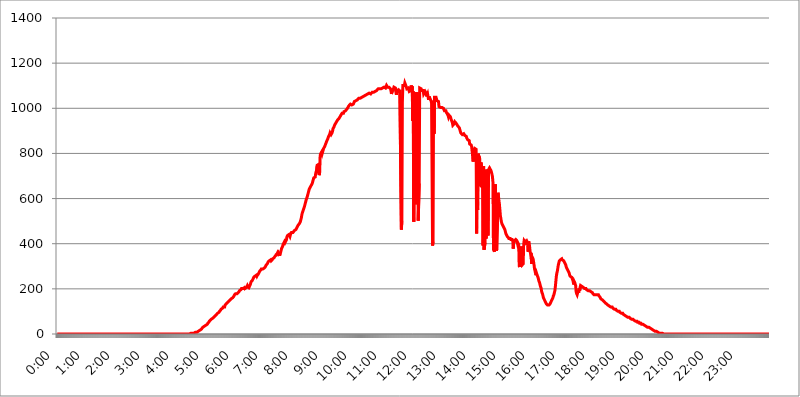
| Category | 2015.06.02. Intenzitás [W/m^2] |
|---|---|
| 0.0 | 0 |
| 0.0006944444444444445 | 0 |
| 0.001388888888888889 | 0 |
| 0.0020833333333333333 | 0 |
| 0.002777777777777778 | 0 |
| 0.003472222222222222 | 0 |
| 0.004166666666666667 | 0 |
| 0.004861111111111111 | 0 |
| 0.005555555555555556 | 0 |
| 0.0062499999999999995 | 0 |
| 0.006944444444444444 | 0 |
| 0.007638888888888889 | 0 |
| 0.008333333333333333 | 0 |
| 0.009027777777777779 | 0 |
| 0.009722222222222222 | 0 |
| 0.010416666666666666 | 0 |
| 0.011111111111111112 | 0 |
| 0.011805555555555555 | 0 |
| 0.012499999999999999 | 0 |
| 0.013194444444444444 | 0 |
| 0.013888888888888888 | 0 |
| 0.014583333333333332 | 0 |
| 0.015277777777777777 | 0 |
| 0.015972222222222224 | 0 |
| 0.016666666666666666 | 0 |
| 0.017361111111111112 | 0 |
| 0.018055555555555557 | 0 |
| 0.01875 | 0 |
| 0.019444444444444445 | 0 |
| 0.02013888888888889 | 0 |
| 0.020833333333333332 | 0 |
| 0.02152777777777778 | 0 |
| 0.022222222222222223 | 0 |
| 0.02291666666666667 | 0 |
| 0.02361111111111111 | 0 |
| 0.024305555555555556 | 0 |
| 0.024999999999999998 | 0 |
| 0.025694444444444447 | 0 |
| 0.02638888888888889 | 0 |
| 0.027083333333333334 | 0 |
| 0.027777777777777776 | 0 |
| 0.02847222222222222 | 0 |
| 0.029166666666666664 | 0 |
| 0.029861111111111113 | 0 |
| 0.030555555555555555 | 0 |
| 0.03125 | 0 |
| 0.03194444444444445 | 0 |
| 0.03263888888888889 | 0 |
| 0.03333333333333333 | 0 |
| 0.034027777777777775 | 0 |
| 0.034722222222222224 | 0 |
| 0.035416666666666666 | 0 |
| 0.036111111111111115 | 0 |
| 0.03680555555555556 | 0 |
| 0.0375 | 0 |
| 0.03819444444444444 | 0 |
| 0.03888888888888889 | 0 |
| 0.03958333333333333 | 0 |
| 0.04027777777777778 | 0 |
| 0.04097222222222222 | 0 |
| 0.041666666666666664 | 0 |
| 0.042361111111111106 | 0 |
| 0.04305555555555556 | 0 |
| 0.043750000000000004 | 0 |
| 0.044444444444444446 | 0 |
| 0.04513888888888889 | 0 |
| 0.04583333333333334 | 0 |
| 0.04652777777777778 | 0 |
| 0.04722222222222222 | 0 |
| 0.04791666666666666 | 0 |
| 0.04861111111111111 | 0 |
| 0.049305555555555554 | 0 |
| 0.049999999999999996 | 0 |
| 0.05069444444444445 | 0 |
| 0.051388888888888894 | 0 |
| 0.052083333333333336 | 0 |
| 0.05277777777777778 | 0 |
| 0.05347222222222222 | 0 |
| 0.05416666666666667 | 0 |
| 0.05486111111111111 | 0 |
| 0.05555555555555555 | 0 |
| 0.05625 | 0 |
| 0.05694444444444444 | 0 |
| 0.057638888888888885 | 0 |
| 0.05833333333333333 | 0 |
| 0.05902777777777778 | 0 |
| 0.059722222222222225 | 0 |
| 0.06041666666666667 | 0 |
| 0.061111111111111116 | 0 |
| 0.06180555555555556 | 0 |
| 0.0625 | 0 |
| 0.06319444444444444 | 0 |
| 0.06388888888888888 | 0 |
| 0.06458333333333334 | 0 |
| 0.06527777777777778 | 0 |
| 0.06597222222222222 | 0 |
| 0.06666666666666667 | 0 |
| 0.06736111111111111 | 0 |
| 0.06805555555555555 | 0 |
| 0.06874999999999999 | 0 |
| 0.06944444444444443 | 0 |
| 0.07013888888888889 | 0 |
| 0.07083333333333333 | 0 |
| 0.07152777777777779 | 0 |
| 0.07222222222222223 | 0 |
| 0.07291666666666667 | 0 |
| 0.07361111111111111 | 0 |
| 0.07430555555555556 | 0 |
| 0.075 | 0 |
| 0.07569444444444444 | 0 |
| 0.0763888888888889 | 0 |
| 0.07708333333333334 | 0 |
| 0.07777777777777778 | 0 |
| 0.07847222222222222 | 0 |
| 0.07916666666666666 | 0 |
| 0.0798611111111111 | 0 |
| 0.08055555555555556 | 0 |
| 0.08125 | 0 |
| 0.08194444444444444 | 0 |
| 0.08263888888888889 | 0 |
| 0.08333333333333333 | 0 |
| 0.08402777777777777 | 0 |
| 0.08472222222222221 | 0 |
| 0.08541666666666665 | 0 |
| 0.08611111111111112 | 0 |
| 0.08680555555555557 | 0 |
| 0.08750000000000001 | 0 |
| 0.08819444444444445 | 0 |
| 0.08888888888888889 | 0 |
| 0.08958333333333333 | 0 |
| 0.09027777777777778 | 0 |
| 0.09097222222222222 | 0 |
| 0.09166666666666667 | 0 |
| 0.09236111111111112 | 0 |
| 0.09305555555555556 | 0 |
| 0.09375 | 0 |
| 0.09444444444444444 | 0 |
| 0.09513888888888888 | 0 |
| 0.09583333333333333 | 0 |
| 0.09652777777777777 | 0 |
| 0.09722222222222222 | 0 |
| 0.09791666666666667 | 0 |
| 0.09861111111111111 | 0 |
| 0.09930555555555555 | 0 |
| 0.09999999999999999 | 0 |
| 0.10069444444444443 | 0 |
| 0.1013888888888889 | 0 |
| 0.10208333333333335 | 0 |
| 0.10277777777777779 | 0 |
| 0.10347222222222223 | 0 |
| 0.10416666666666667 | 0 |
| 0.10486111111111111 | 0 |
| 0.10555555555555556 | 0 |
| 0.10625 | 0 |
| 0.10694444444444444 | 0 |
| 0.1076388888888889 | 0 |
| 0.10833333333333334 | 0 |
| 0.10902777777777778 | 0 |
| 0.10972222222222222 | 0 |
| 0.1111111111111111 | 0 |
| 0.11180555555555556 | 0 |
| 0.11180555555555556 | 0 |
| 0.1125 | 0 |
| 0.11319444444444444 | 0 |
| 0.11388888888888889 | 0 |
| 0.11458333333333333 | 0 |
| 0.11527777777777777 | 0 |
| 0.11597222222222221 | 0 |
| 0.11666666666666665 | 0 |
| 0.1173611111111111 | 0 |
| 0.11805555555555557 | 0 |
| 0.11944444444444445 | 0 |
| 0.12013888888888889 | 0 |
| 0.12083333333333333 | 0 |
| 0.12152777777777778 | 0 |
| 0.12222222222222223 | 0 |
| 0.12291666666666667 | 0 |
| 0.12291666666666667 | 0 |
| 0.12361111111111112 | 0 |
| 0.12430555555555556 | 0 |
| 0.125 | 0 |
| 0.12569444444444444 | 0 |
| 0.12638888888888888 | 0 |
| 0.12708333333333333 | 0 |
| 0.16875 | 0 |
| 0.12847222222222224 | 0 |
| 0.12916666666666668 | 0 |
| 0.12986111111111112 | 0 |
| 0.13055555555555556 | 0 |
| 0.13125 | 0 |
| 0.13194444444444445 | 0 |
| 0.1326388888888889 | 0 |
| 0.13333333333333333 | 0 |
| 0.13402777777777777 | 0 |
| 0.13402777777777777 | 0 |
| 0.13472222222222222 | 0 |
| 0.13541666666666666 | 0 |
| 0.1361111111111111 | 0 |
| 0.13749999999999998 | 0 |
| 0.13819444444444443 | 0 |
| 0.1388888888888889 | 0 |
| 0.13958333333333334 | 0 |
| 0.14027777777777778 | 0 |
| 0.14097222222222222 | 0 |
| 0.14166666666666666 | 0 |
| 0.1423611111111111 | 0 |
| 0.14305555555555557 | 0 |
| 0.14375000000000002 | 0 |
| 0.14444444444444446 | 0 |
| 0.1451388888888889 | 0 |
| 0.1451388888888889 | 0 |
| 0.14652777777777778 | 0 |
| 0.14722222222222223 | 0 |
| 0.14791666666666667 | 0 |
| 0.1486111111111111 | 0 |
| 0.14930555555555555 | 0 |
| 0.15 | 0 |
| 0.15069444444444444 | 0 |
| 0.15138888888888888 | 0 |
| 0.15208333333333332 | 0 |
| 0.15277777777777776 | 0 |
| 0.15347222222222223 | 0 |
| 0.15416666666666667 | 0 |
| 0.15486111111111112 | 0 |
| 0.15555555555555556 | 0 |
| 0.15625 | 0 |
| 0.15694444444444444 | 0 |
| 0.15763888888888888 | 0 |
| 0.15833333333333333 | 0 |
| 0.15902777777777777 | 0 |
| 0.15972222222222224 | 0 |
| 0.16041666666666668 | 0 |
| 0.16111111111111112 | 0 |
| 0.16180555555555556 | 0 |
| 0.1625 | 0 |
| 0.16319444444444445 | 0 |
| 0.1638888888888889 | 0 |
| 0.16458333333333333 | 0 |
| 0.16527777777777777 | 0 |
| 0.16597222222222222 | 0 |
| 0.16666666666666666 | 0 |
| 0.1673611111111111 | 0 |
| 0.16805555555555554 | 0 |
| 0.16874999999999998 | 0 |
| 0.16944444444444443 | 0 |
| 0.17013888888888887 | 0 |
| 0.1708333333333333 | 0 |
| 0.17152777777777775 | 0 |
| 0.17222222222222225 | 0 |
| 0.1729166666666667 | 0 |
| 0.17361111111111113 | 0 |
| 0.17430555555555557 | 0 |
| 0.17500000000000002 | 0 |
| 0.17569444444444446 | 0 |
| 0.1763888888888889 | 0 |
| 0.17708333333333334 | 0 |
| 0.17777777777777778 | 0 |
| 0.17847222222222223 | 0 |
| 0.17916666666666667 | 0 |
| 0.1798611111111111 | 0 |
| 0.18055555555555555 | 0 |
| 0.18125 | 0 |
| 0.18194444444444444 | 0 |
| 0.1826388888888889 | 0 |
| 0.18333333333333335 | 0 |
| 0.1840277777777778 | 0 |
| 0.18472222222222223 | 0 |
| 0.18541666666666667 | 0 |
| 0.18611111111111112 | 0 |
| 0.18680555555555556 | 3.525 |
| 0.1875 | 3.525 |
| 0.18819444444444444 | 3.525 |
| 0.18888888888888888 | 3.525 |
| 0.18958333333333333 | 3.525 |
| 0.19027777777777777 | 3.525 |
| 0.1909722222222222 | 3.525 |
| 0.19166666666666665 | 3.525 |
| 0.19236111111111112 | 3.525 |
| 0.19305555555555554 | 3.525 |
| 0.19375 | 7.887 |
| 0.19444444444444445 | 7.887 |
| 0.1951388888888889 | 7.887 |
| 0.19583333333333333 | 7.887 |
| 0.19652777777777777 | 12.257 |
| 0.19722222222222222 | 12.257 |
| 0.19791666666666666 | 12.257 |
| 0.1986111111111111 | 12.257 |
| 0.19930555555555554 | 12.257 |
| 0.19999999999999998 | 16.636 |
| 0.20069444444444443 | 16.636 |
| 0.20138888888888887 | 16.636 |
| 0.2020833333333333 | 21.024 |
| 0.2027777777777778 | 21.024 |
| 0.2034722222222222 | 25.419 |
| 0.2041666666666667 | 29.823 |
| 0.20486111111111113 | 29.823 |
| 0.20555555555555557 | 29.823 |
| 0.20625000000000002 | 34.234 |
| 0.20694444444444446 | 34.234 |
| 0.2076388888888889 | 38.653 |
| 0.20833333333333334 | 38.653 |
| 0.20902777777777778 | 43.079 |
| 0.20972222222222223 | 43.079 |
| 0.21041666666666667 | 43.079 |
| 0.2111111111111111 | 47.511 |
| 0.21180555555555555 | 47.511 |
| 0.2125 | 51.951 |
| 0.21319444444444444 | 56.398 |
| 0.2138888888888889 | 56.398 |
| 0.21458333333333335 | 60.85 |
| 0.2152777777777778 | 60.85 |
| 0.21597222222222223 | 65.31 |
| 0.21666666666666667 | 65.31 |
| 0.21736111111111112 | 65.31 |
| 0.21805555555555556 | 69.775 |
| 0.21875 | 69.775 |
| 0.21944444444444444 | 74.246 |
| 0.22013888888888888 | 74.246 |
| 0.22083333333333333 | 78.722 |
| 0.22152777777777777 | 78.722 |
| 0.2222222222222222 | 83.205 |
| 0.22291666666666665 | 83.205 |
| 0.2236111111111111 | 87.692 |
| 0.22430555555555556 | 87.692 |
| 0.225 | 92.184 |
| 0.22569444444444445 | 92.184 |
| 0.2263888888888889 | 92.184 |
| 0.22708333333333333 | 96.682 |
| 0.22777777777777777 | 101.184 |
| 0.22847222222222222 | 101.184 |
| 0.22916666666666666 | 105.69 |
| 0.2298611111111111 | 110.201 |
| 0.23055555555555554 | 110.201 |
| 0.23124999999999998 | 110.201 |
| 0.23194444444444443 | 114.716 |
| 0.23263888888888887 | 119.235 |
| 0.2333333333333333 | 119.235 |
| 0.2340277777777778 | 119.235 |
| 0.2347222222222222 | 119.235 |
| 0.2354166666666667 | 128.284 |
| 0.23611111111111113 | 128.284 |
| 0.23680555555555557 | 132.814 |
| 0.23750000000000002 | 132.814 |
| 0.23819444444444446 | 137.347 |
| 0.2388888888888889 | 137.347 |
| 0.23958333333333334 | 141.884 |
| 0.24027777777777778 | 141.884 |
| 0.24097222222222223 | 146.423 |
| 0.24166666666666667 | 146.423 |
| 0.2423611111111111 | 150.964 |
| 0.24305555555555555 | 150.964 |
| 0.24375 | 155.509 |
| 0.24444444444444446 | 155.509 |
| 0.24513888888888888 | 155.509 |
| 0.24583333333333335 | 160.056 |
| 0.2465277777777778 | 160.056 |
| 0.24722222222222223 | 164.605 |
| 0.24791666666666667 | 169.156 |
| 0.24861111111111112 | 173.709 |
| 0.24930555555555556 | 173.709 |
| 0.25 | 178.264 |
| 0.25069444444444444 | 178.264 |
| 0.2513888888888889 | 178.264 |
| 0.2520833333333333 | 178.264 |
| 0.25277777777777777 | 178.264 |
| 0.2534722222222222 | 182.82 |
| 0.25416666666666665 | 182.82 |
| 0.2548611111111111 | 187.378 |
| 0.2555555555555556 | 191.937 |
| 0.25625000000000003 | 191.937 |
| 0.2569444444444445 | 191.937 |
| 0.2576388888888889 | 196.497 |
| 0.25833333333333336 | 201.058 |
| 0.2590277777777778 | 201.058 |
| 0.25972222222222224 | 201.058 |
| 0.2604166666666667 | 201.058 |
| 0.2611111111111111 | 201.058 |
| 0.26180555555555557 | 201.058 |
| 0.2625 | 205.62 |
| 0.26319444444444445 | 201.058 |
| 0.2638888888888889 | 201.058 |
| 0.26458333333333334 | 201.058 |
| 0.2652777777777778 | 205.62 |
| 0.2659722222222222 | 210.182 |
| 0.26666666666666666 | 214.746 |
| 0.2673611111111111 | 210.182 |
| 0.26805555555555555 | 210.182 |
| 0.26875 | 205.62 |
| 0.26944444444444443 | 205.62 |
| 0.2701388888888889 | 214.746 |
| 0.2708333333333333 | 219.309 |
| 0.27152777777777776 | 228.436 |
| 0.2722222222222222 | 233 |
| 0.27291666666666664 | 233 |
| 0.2736111111111111 | 237.564 |
| 0.2743055555555555 | 242.127 |
| 0.27499999999999997 | 246.689 |
| 0.27569444444444446 | 251.251 |
| 0.27638888888888885 | 251.251 |
| 0.27708333333333335 | 255.813 |
| 0.2777777777777778 | 255.813 |
| 0.27847222222222223 | 255.813 |
| 0.2791666666666667 | 260.373 |
| 0.2798611111111111 | 255.813 |
| 0.28055555555555556 | 260.373 |
| 0.28125 | 260.373 |
| 0.28194444444444444 | 264.932 |
| 0.2826388888888889 | 269.49 |
| 0.2833333333333333 | 274.047 |
| 0.28402777777777777 | 278.603 |
| 0.2847222222222222 | 278.603 |
| 0.28541666666666665 | 283.156 |
| 0.28611111111111115 | 287.709 |
| 0.28680555555555554 | 287.709 |
| 0.28750000000000003 | 287.709 |
| 0.2881944444444445 | 287.709 |
| 0.2888888888888889 | 287.709 |
| 0.28958333333333336 | 287.709 |
| 0.2902777777777778 | 292.259 |
| 0.29097222222222224 | 292.259 |
| 0.2916666666666667 | 296.808 |
| 0.2923611111111111 | 301.354 |
| 0.29305555555555557 | 305.898 |
| 0.29375 | 305.898 |
| 0.29444444444444445 | 310.44 |
| 0.2951388888888889 | 314.98 |
| 0.29583333333333334 | 319.517 |
| 0.2965277777777778 | 319.517 |
| 0.2972222222222222 | 324.052 |
| 0.29791666666666666 | 324.052 |
| 0.2986111111111111 | 324.052 |
| 0.29930555555555555 | 328.584 |
| 0.3 | 324.052 |
| 0.30069444444444443 | 324.052 |
| 0.3013888888888889 | 328.584 |
| 0.3020833333333333 | 333.113 |
| 0.30277777777777776 | 333.113 |
| 0.3034722222222222 | 333.113 |
| 0.30416666666666664 | 337.639 |
| 0.3048611111111111 | 342.162 |
| 0.3055555555555555 | 342.162 |
| 0.30624999999999997 | 346.682 |
| 0.3069444444444444 | 351.198 |
| 0.3076388888888889 | 351.198 |
| 0.30833333333333335 | 355.712 |
| 0.3090277777777778 | 360.221 |
| 0.30972222222222223 | 355.712 |
| 0.3104166666666667 | 360.221 |
| 0.3111111111111111 | 355.712 |
| 0.31180555555555556 | 346.682 |
| 0.3125 | 355.712 |
| 0.31319444444444444 | 360.221 |
| 0.3138888888888889 | 369.23 |
| 0.3145833333333333 | 378.224 |
| 0.31527777777777777 | 382.715 |
| 0.3159722222222222 | 387.202 |
| 0.31666666666666665 | 396.164 |
| 0.31736111111111115 | 400.638 |
| 0.31805555555555554 | 405.108 |
| 0.31875000000000003 | 409.574 |
| 0.3194444444444445 | 405.108 |
| 0.3201388888888889 | 409.574 |
| 0.32083333333333336 | 414.035 |
| 0.3215277777777778 | 418.492 |
| 0.32222222222222224 | 431.833 |
| 0.3229166666666667 | 436.27 |
| 0.3236111111111111 | 436.27 |
| 0.32430555555555557 | 436.27 |
| 0.325 | 440.702 |
| 0.32569444444444445 | 436.27 |
| 0.3263888888888889 | 431.833 |
| 0.32708333333333334 | 440.702 |
| 0.3277777777777778 | 445.129 |
| 0.3284722222222222 | 449.551 |
| 0.32916666666666666 | 449.551 |
| 0.3298611111111111 | 449.551 |
| 0.33055555555555555 | 449.551 |
| 0.33125 | 449.551 |
| 0.33194444444444443 | 453.968 |
| 0.3326388888888889 | 458.38 |
| 0.3333333333333333 | 458.38 |
| 0.3340277777777778 | 462.786 |
| 0.3347222222222222 | 462.786 |
| 0.3354166666666667 | 467.187 |
| 0.3361111111111111 | 471.582 |
| 0.3368055555555556 | 475.972 |
| 0.33749999999999997 | 480.356 |
| 0.33819444444444446 | 480.356 |
| 0.33888888888888885 | 484.735 |
| 0.33958333333333335 | 489.108 |
| 0.34027777777777773 | 493.475 |
| 0.34097222222222223 | 497.836 |
| 0.3416666666666666 | 506.542 |
| 0.3423611111111111 | 515.223 |
| 0.3430555555555555 | 528.2 |
| 0.34375 | 536.82 |
| 0.3444444444444445 | 536.82 |
| 0.3451388888888889 | 549.704 |
| 0.3458333333333334 | 549.704 |
| 0.34652777777777777 | 562.53 |
| 0.34722222222222227 | 571.049 |
| 0.34791666666666665 | 579.542 |
| 0.34861111111111115 | 588.009 |
| 0.34930555555555554 | 596.45 |
| 0.35000000000000003 | 600.661 |
| 0.3506944444444444 | 609.062 |
| 0.3513888888888889 | 617.436 |
| 0.3520833333333333 | 617.436 |
| 0.3527777777777778 | 634.105 |
| 0.3534722222222222 | 642.4 |
| 0.3541666666666667 | 642.4 |
| 0.3548611111111111 | 650.667 |
| 0.35555555555555557 | 654.791 |
| 0.35625 | 658.909 |
| 0.35694444444444445 | 663.019 |
| 0.3576388888888889 | 667.123 |
| 0.35833333333333334 | 675.311 |
| 0.3590277777777778 | 683.473 |
| 0.3597222222222222 | 691.608 |
| 0.36041666666666666 | 695.666 |
| 0.3611111111111111 | 695.666 |
| 0.36180555555555555 | 695.666 |
| 0.3625 | 711.832 |
| 0.36319444444444443 | 719.877 |
| 0.3638888888888889 | 711.832 |
| 0.3645833333333333 | 747.834 |
| 0.3652777777777778 | 743.859 |
| 0.3659722222222222 | 751.803 |
| 0.3666666666666667 | 751.803 |
| 0.3673611111111111 | 703.762 |
| 0.3680555555555556 | 715.858 |
| 0.36874999999999997 | 791.169 |
| 0.36944444444444446 | 798.974 |
| 0.37013888888888885 | 802.868 |
| 0.37083333333333335 | 806.757 |
| 0.37152777777777773 | 798.974 |
| 0.37222222222222223 | 806.757 |
| 0.3729166666666666 | 814.519 |
| 0.3736111111111111 | 822.26 |
| 0.3743055555555555 | 826.123 |
| 0.375 | 829.981 |
| 0.3756944444444445 | 833.834 |
| 0.3763888888888889 | 841.526 |
| 0.3770833333333334 | 845.365 |
| 0.37777777777777777 | 853.029 |
| 0.37847222222222227 | 853.029 |
| 0.37916666666666665 | 856.855 |
| 0.37986111111111115 | 868.305 |
| 0.38055555555555554 | 875.918 |
| 0.38125000000000003 | 879.719 |
| 0.3819444444444444 | 883.516 |
| 0.3826388888888889 | 891.099 |
| 0.3833333333333333 | 894.885 |
| 0.3840277777777778 | 883.516 |
| 0.3847222222222222 | 883.516 |
| 0.3854166666666667 | 891.099 |
| 0.3861111111111111 | 898.668 |
| 0.38680555555555557 | 909.996 |
| 0.3875 | 913.766 |
| 0.38819444444444445 | 917.534 |
| 0.3888888888888889 | 925.06 |
| 0.38958333333333334 | 928.819 |
| 0.3902777777777778 | 932.576 |
| 0.3909722222222222 | 936.33 |
| 0.39166666666666666 | 940.082 |
| 0.3923611111111111 | 943.832 |
| 0.39305555555555555 | 947.58 |
| 0.39375 | 947.58 |
| 0.39444444444444443 | 951.327 |
| 0.3951388888888889 | 955.071 |
| 0.3958333333333333 | 958.814 |
| 0.3965277777777778 | 962.555 |
| 0.3972222222222222 | 966.295 |
| 0.3979166666666667 | 970.034 |
| 0.3986111111111111 | 973.772 |
| 0.3993055555555556 | 977.508 |
| 0.39999999999999997 | 977.508 |
| 0.40069444444444446 | 977.508 |
| 0.40138888888888885 | 977.508 |
| 0.40208333333333335 | 984.98 |
| 0.40277777777777773 | 984.98 |
| 0.40347222222222223 | 988.714 |
| 0.4041666666666666 | 988.714 |
| 0.4048611111111111 | 988.714 |
| 0.4055555555555555 | 992.448 |
| 0.40625 | 996.182 |
| 0.4069444444444445 | 999.916 |
| 0.4076388888888889 | 1003.65 |
| 0.4083333333333334 | 1007.383 |
| 0.40902777777777777 | 1011.118 |
| 0.40972222222222227 | 1014.852 |
| 0.41041666666666665 | 1014.852 |
| 0.41111111111111115 | 1018.587 |
| 0.41180555555555554 | 1018.587 |
| 0.41250000000000003 | 1014.852 |
| 0.4131944444444444 | 1014.852 |
| 0.4138888888888889 | 1014.852 |
| 0.4145833333333333 | 1018.587 |
| 0.4152777777777778 | 1018.587 |
| 0.4159722222222222 | 1022.323 |
| 0.4166666666666667 | 1029.798 |
| 0.4173611111111111 | 1029.798 |
| 0.41805555555555557 | 1029.798 |
| 0.41875 | 1033.537 |
| 0.41944444444444445 | 1037.277 |
| 0.4201388888888889 | 1037.277 |
| 0.42083333333333334 | 1037.277 |
| 0.4215277777777778 | 1041.019 |
| 0.4222222222222222 | 1041.019 |
| 0.42291666666666666 | 1044.762 |
| 0.4236111111111111 | 1044.762 |
| 0.42430555555555555 | 1048.508 |
| 0.425 | 1044.762 |
| 0.42569444444444443 | 1048.508 |
| 0.4263888888888889 | 1048.508 |
| 0.4270833333333333 | 1048.508 |
| 0.4277777777777778 | 1052.255 |
| 0.4284722222222222 | 1052.255 |
| 0.4291666666666667 | 1052.255 |
| 0.4298611111111111 | 1052.255 |
| 0.4305555555555556 | 1056.004 |
| 0.43124999999999997 | 1056.004 |
| 0.43194444444444446 | 1059.756 |
| 0.43263888888888885 | 1059.756 |
| 0.43333333333333335 | 1059.756 |
| 0.43402777777777773 | 1059.756 |
| 0.43472222222222223 | 1063.51 |
| 0.4354166666666666 | 1063.51 |
| 0.4361111111111111 | 1063.51 |
| 0.4368055555555555 | 1063.51 |
| 0.4375 | 1067.267 |
| 0.4381944444444445 | 1067.267 |
| 0.4388888888888889 | 1067.267 |
| 0.4395833333333334 | 1063.51 |
| 0.44027777777777777 | 1067.267 |
| 0.44097222222222227 | 1067.267 |
| 0.44166666666666665 | 1071.027 |
| 0.44236111111111115 | 1067.267 |
| 0.44305555555555554 | 1074.789 |
| 0.44375000000000003 | 1071.027 |
| 0.4444444444444444 | 1074.789 |
| 0.4451388888888889 | 1074.789 |
| 0.4458333333333333 | 1074.789 |
| 0.4465277777777778 | 1078.555 |
| 0.4472222222222222 | 1078.555 |
| 0.4479166666666667 | 1078.555 |
| 0.4486111111111111 | 1082.324 |
| 0.44930555555555557 | 1082.324 |
| 0.45 | 1086.097 |
| 0.45069444444444445 | 1086.097 |
| 0.4513888888888889 | 1086.097 |
| 0.45208333333333334 | 1086.097 |
| 0.4527777777777778 | 1086.097 |
| 0.4534722222222222 | 1086.097 |
| 0.45416666666666666 | 1086.097 |
| 0.4548611111111111 | 1089.873 |
| 0.45555555555555555 | 1089.873 |
| 0.45625 | 1089.873 |
| 0.45694444444444443 | 1089.873 |
| 0.4576388888888889 | 1089.873 |
| 0.4583333333333333 | 1093.653 |
| 0.4590277777777778 | 1093.653 |
| 0.4597222222222222 | 1093.653 |
| 0.4604166666666667 | 1089.873 |
| 0.4611111111111111 | 1093.653 |
| 0.4618055555555556 | 1101.226 |
| 0.46249999999999997 | 1097.437 |
| 0.46319444444444446 | 1093.653 |
| 0.46388888888888885 | 1093.653 |
| 0.46458333333333335 | 1093.653 |
| 0.46527777777777773 | 1093.653 |
| 0.46597222222222223 | 1093.653 |
| 0.4666666666666666 | 1089.873 |
| 0.4673611111111111 | 1086.097 |
| 0.4680555555555555 | 1078.555 |
| 0.46875 | 1063.51 |
| 0.4694444444444445 | 1067.267 |
| 0.4701388888888889 | 1078.555 |
| 0.4708333333333334 | 1082.324 |
| 0.47152777777777777 | 1086.097 |
| 0.47222222222222227 | 1093.653 |
| 0.47291666666666665 | 1097.437 |
| 0.47361111111111115 | 1093.653 |
| 0.47430555555555554 | 1089.873 |
| 0.47500000000000003 | 1071.027 |
| 0.4756944444444444 | 1059.756 |
| 0.4763888888888889 | 1078.555 |
| 0.4770833333333333 | 1074.789 |
| 0.4777777777777778 | 1082.324 |
| 0.4784722222222222 | 1082.324 |
| 0.4791666666666667 | 1078.555 |
| 0.4798611111111111 | 1074.789 |
| 0.48055555555555557 | 1082.324 |
| 0.48125 | 1086.097 |
| 0.48194444444444445 | 1086.097 |
| 0.4826388888888889 | 462.786 |
| 0.48333333333333334 | 502.192 |
| 0.4840277777777778 | 1026.06 |
| 0.4847222222222222 | 1101.226 |
| 0.48541666666666666 | 1097.437 |
| 0.4861111111111111 | 1105.019 |
| 0.48680555555555555 | 1101.226 |
| 0.4875 | 1112.618 |
| 0.48819444444444443 | 1116.426 |
| 0.4888888888888889 | 1101.226 |
| 0.4895833333333333 | 1105.019 |
| 0.4902777777777778 | 1086.097 |
| 0.4909722222222222 | 1089.873 |
| 0.4916666666666667 | 1089.873 |
| 0.4923611111111111 | 1089.873 |
| 0.4930555555555556 | 1093.653 |
| 0.49374999999999997 | 1074.789 |
| 0.49444444444444446 | 1078.555 |
| 0.49513888888888885 | 1071.027 |
| 0.49583333333333335 | 1078.555 |
| 0.49652777777777773 | 1101.226 |
| 0.49722222222222223 | 1089.873 |
| 0.4979166666666666 | 1097.437 |
| 0.4986111111111111 | 943.832 |
| 0.4993055555555555 | 1074.789 |
| 0.5 | 497.836 |
| 0.5006944444444444 | 891.099 |
| 0.5013888888888889 | 1071.027 |
| 0.5020833333333333 | 1067.267 |
| 0.5027777777777778 | 575.299 |
| 0.5034722222222222 | 1033.537 |
| 0.5041666666666667 | 1059.756 |
| 0.5048611111111111 | 1071.027 |
| 0.5055555555555555 | 928.819 |
| 0.50625 | 502.192 |
| 0.5069444444444444 | 506.542 |
| 0.5076388888888889 | 667.123 |
| 0.5083333333333333 | 1089.873 |
| 0.5090277777777777 | 1086.097 |
| 0.5097222222222222 | 1089.873 |
| 0.5104166666666666 | 1086.097 |
| 0.5111111111111112 | 1078.555 |
| 0.5118055555555555 | 1074.789 |
| 0.5125000000000001 | 1074.789 |
| 0.5131944444444444 | 1078.555 |
| 0.513888888888889 | 1063.51 |
| 0.5145833333333333 | 1059.756 |
| 0.5152777777777778 | 1063.51 |
| 0.5159722222222222 | 1074.789 |
| 0.5166666666666667 | 1071.027 |
| 0.517361111111111 | 1067.267 |
| 0.5180555555555556 | 1052.255 |
| 0.5187499999999999 | 1056.004 |
| 0.5194444444444445 | 1063.51 |
| 0.5201388888888888 | 1059.756 |
| 0.5208333333333334 | 1037.277 |
| 0.5215277777777778 | 1052.255 |
| 0.5222222222222223 | 1048.508 |
| 0.5229166666666667 | 1041.019 |
| 0.5236111111111111 | 1037.277 |
| 0.5243055555555556 | 1033.537 |
| 0.525 | 1022.323 |
| 0.5256944444444445 | 1026.06 |
| 0.5263888888888889 | 391.685 |
| 0.5270833333333333 | 409.574 |
| 0.5277777777777778 | 1033.537 |
| 0.5284722222222222 | 887.309 |
| 0.5291666666666667 | 1048.508 |
| 0.5298611111111111 | 1044.762 |
| 0.5305555555555556 | 1052.255 |
| 0.53125 | 1048.508 |
| 0.5319444444444444 | 1044.762 |
| 0.5326388888888889 | 1033.537 |
| 0.5333333333333333 | 1037.277 |
| 0.5340277777777778 | 1037.277 |
| 0.5347222222222222 | 1029.798 |
| 0.5354166666666667 | 1007.383 |
| 0.5361111111111111 | 1011.118 |
| 0.5368055555555555 | 1011.118 |
| 0.5375 | 1003.65 |
| 0.5381944444444444 | 1003.65 |
| 0.5388888888888889 | 999.916 |
| 0.5395833333333333 | 1003.65 |
| 0.5402777777777777 | 1003.65 |
| 0.5409722222222222 | 999.916 |
| 0.5416666666666666 | 999.916 |
| 0.5423611111111112 | 996.182 |
| 0.5430555555555555 | 988.714 |
| 0.5437500000000001 | 984.98 |
| 0.5444444444444444 | 984.98 |
| 0.545138888888889 | 988.714 |
| 0.5458333333333333 | 981.244 |
| 0.5465277777777778 | 977.508 |
| 0.5472222222222222 | 977.508 |
| 0.5479166666666667 | 970.034 |
| 0.548611111111111 | 962.555 |
| 0.5493055555555556 | 970.034 |
| 0.5499999999999999 | 970.034 |
| 0.5506944444444445 | 966.295 |
| 0.5513888888888888 | 962.555 |
| 0.5520833333333334 | 955.071 |
| 0.5527777777777778 | 947.58 |
| 0.5534722222222223 | 943.832 |
| 0.5541666666666667 | 936.33 |
| 0.5548611111111111 | 925.06 |
| 0.5555555555555556 | 925.06 |
| 0.55625 | 928.819 |
| 0.5569444444444445 | 932.576 |
| 0.5576388888888889 | 940.082 |
| 0.5583333333333333 | 936.33 |
| 0.5590277777777778 | 936.33 |
| 0.5597222222222222 | 932.576 |
| 0.5604166666666667 | 928.819 |
| 0.5611111111111111 | 928.819 |
| 0.5618055555555556 | 921.298 |
| 0.5625 | 917.534 |
| 0.5631944444444444 | 921.298 |
| 0.5638888888888889 | 913.766 |
| 0.5645833333333333 | 909.996 |
| 0.5652777777777778 | 898.668 |
| 0.5659722222222222 | 891.099 |
| 0.5666666666666667 | 887.309 |
| 0.5673611111111111 | 887.309 |
| 0.5680555555555555 | 883.516 |
| 0.56875 | 879.719 |
| 0.5694444444444444 | 883.516 |
| 0.5701388888888889 | 887.309 |
| 0.5708333333333333 | 883.516 |
| 0.5715277777777777 | 879.719 |
| 0.5722222222222222 | 879.719 |
| 0.5729166666666666 | 875.918 |
| 0.5736111111111112 | 875.918 |
| 0.5743055555555555 | 868.305 |
| 0.5750000000000001 | 864.493 |
| 0.5756944444444444 | 860.676 |
| 0.576388888888889 | 860.676 |
| 0.5770833333333333 | 860.676 |
| 0.5777777777777778 | 856.855 |
| 0.5784722222222222 | 841.526 |
| 0.5791666666666667 | 841.526 |
| 0.579861111111111 | 837.682 |
| 0.5805555555555556 | 837.682 |
| 0.5812499999999999 | 829.981 |
| 0.5819444444444445 | 826.123 |
| 0.5826388888888888 | 829.981 |
| 0.5833333333333334 | 763.674 |
| 0.5840277777777778 | 814.519 |
| 0.5847222222222223 | 814.519 |
| 0.5854166666666667 | 822.26 |
| 0.5861111111111111 | 822.26 |
| 0.5868055555555556 | 822.26 |
| 0.5875 | 818.392 |
| 0.5881944444444445 | 445.129 |
| 0.5888888888888889 | 779.42 |
| 0.5895833333333333 | 549.704 |
| 0.5902777777777778 | 798.974 |
| 0.5909722222222222 | 791.169 |
| 0.5916666666666667 | 791.169 |
| 0.5923611111111111 | 783.342 |
| 0.5930555555555556 | 707.8 |
| 0.59375 | 654.791 |
| 0.5944444444444444 | 759.723 |
| 0.5951388888888889 | 650.667 |
| 0.5958333333333333 | 671.22 |
| 0.5965277777777778 | 646.537 |
| 0.5972222222222222 | 391.685 |
| 0.5979166666666667 | 743.859 |
| 0.5986111111111111 | 373.729 |
| 0.5993055555555555 | 373.729 |
| 0.6 | 405.108 |
| 0.6006944444444444 | 727.896 |
| 0.6013888888888889 | 422.943 |
| 0.6020833333333333 | 727.896 |
| 0.6027777777777777 | 731.896 |
| 0.6034722222222222 | 715.858 |
| 0.6041666666666666 | 436.27 |
| 0.6048611111111112 | 727.896 |
| 0.6055555555555555 | 723.889 |
| 0.6062500000000001 | 735.89 |
| 0.6069444444444444 | 735.89 |
| 0.607638888888889 | 731.896 |
| 0.6083333333333333 | 723.889 |
| 0.6090277777777778 | 715.858 |
| 0.6097222222222222 | 707.8 |
| 0.6104166666666667 | 695.666 |
| 0.611111111111111 | 671.22 |
| 0.6118055555555556 | 373.729 |
| 0.6124999999999999 | 369.23 |
| 0.6131944444444445 | 364.728 |
| 0.6138888888888888 | 592.233 |
| 0.6145833333333334 | 663.019 |
| 0.6152777777777778 | 396.164 |
| 0.6159722222222223 | 369.23 |
| 0.6166666666666667 | 378.224 |
| 0.6173611111111111 | 462.786 |
| 0.6180555555555556 | 625.784 |
| 0.61875 | 613.252 |
| 0.6194444444444445 | 592.233 |
| 0.6201388888888889 | 575.299 |
| 0.6208333333333333 | 549.704 |
| 0.6215277777777778 | 523.88 |
| 0.6222222222222222 | 510.885 |
| 0.6229166666666667 | 497.836 |
| 0.6236111111111111 | 489.108 |
| 0.6243055555555556 | 484.735 |
| 0.625 | 480.356 |
| 0.6256944444444444 | 480.356 |
| 0.6263888888888889 | 471.582 |
| 0.6270833333333333 | 467.187 |
| 0.6277777777777778 | 462.786 |
| 0.6284722222222222 | 453.968 |
| 0.6291666666666667 | 445.129 |
| 0.6298611111111111 | 440.702 |
| 0.6305555555555555 | 436.27 |
| 0.63125 | 431.833 |
| 0.6319444444444444 | 431.833 |
| 0.6326388888888889 | 427.39 |
| 0.6333333333333333 | 422.943 |
| 0.6340277777777777 | 422.943 |
| 0.6347222222222222 | 422.943 |
| 0.6354166666666666 | 422.943 |
| 0.6361111111111112 | 418.492 |
| 0.6368055555555555 | 418.492 |
| 0.6375000000000001 | 418.492 |
| 0.6381944444444444 | 418.492 |
| 0.638888888888889 | 414.035 |
| 0.6395833333333333 | 378.224 |
| 0.6402777777777778 | 414.035 |
| 0.6409722222222222 | 409.574 |
| 0.6416666666666667 | 414.035 |
| 0.642361111111111 | 414.035 |
| 0.6430555555555556 | 418.492 |
| 0.6437499999999999 | 418.492 |
| 0.6444444444444445 | 414.035 |
| 0.6451388888888888 | 405.108 |
| 0.6458333333333334 | 396.164 |
| 0.6465277777777778 | 400.638 |
| 0.6472222222222223 | 396.164 |
| 0.6479166666666667 | 301.354 |
| 0.6486111111111111 | 296.808 |
| 0.6493055555555556 | 296.808 |
| 0.65 | 296.808 |
| 0.6506944444444445 | 387.202 |
| 0.6513888888888889 | 319.517 |
| 0.6520833333333333 | 305.898 |
| 0.6527777777777778 | 305.898 |
| 0.6534722222222222 | 310.44 |
| 0.6541666666666667 | 396.164 |
| 0.6548611111111111 | 414.035 |
| 0.6555555555555556 | 414.035 |
| 0.65625 | 414.035 |
| 0.6569444444444444 | 405.108 |
| 0.6576388888888889 | 409.574 |
| 0.6583333333333333 | 405.108 |
| 0.6590277777777778 | 409.574 |
| 0.6597222222222222 | 405.108 |
| 0.6604166666666667 | 364.728 |
| 0.6611111111111111 | 409.574 |
| 0.6618055555555555 | 405.108 |
| 0.6625 | 387.202 |
| 0.6631944444444444 | 364.728 |
| 0.6638888888888889 | 355.712 |
| 0.6645833333333333 | 360.221 |
| 0.6652777777777777 | 310.44 |
| 0.6659722222222222 | 310.44 |
| 0.6666666666666666 | 337.639 |
| 0.6673611111111111 | 333.113 |
| 0.6680555555555556 | 319.517 |
| 0.6687500000000001 | 305.898 |
| 0.6694444444444444 | 287.709 |
| 0.6701388888888888 | 278.603 |
| 0.6708333333333334 | 269.49 |
| 0.6715277777777778 | 260.373 |
| 0.6722222222222222 | 269.49 |
| 0.6729166666666666 | 269.49 |
| 0.6736111111111112 | 255.813 |
| 0.6743055555555556 | 251.251 |
| 0.6749999999999999 | 242.127 |
| 0.6756944444444444 | 233 |
| 0.6763888888888889 | 228.436 |
| 0.6770833333333334 | 219.309 |
| 0.6777777777777777 | 210.182 |
| 0.6784722222222223 | 205.62 |
| 0.6791666666666667 | 191.937 |
| 0.6798611111111111 | 182.82 |
| 0.6805555555555555 | 178.264 |
| 0.68125 | 169.156 |
| 0.6819444444444445 | 160.056 |
| 0.6826388888888889 | 155.509 |
| 0.6833333333333332 | 150.964 |
| 0.6840277777777778 | 146.423 |
| 0.6847222222222222 | 141.884 |
| 0.6854166666666667 | 137.347 |
| 0.686111111111111 | 132.814 |
| 0.6868055555555556 | 132.814 |
| 0.6875 | 128.284 |
| 0.6881944444444444 | 128.284 |
| 0.688888888888889 | 128.284 |
| 0.6895833333333333 | 128.284 |
| 0.6902777777777778 | 128.284 |
| 0.6909722222222222 | 132.814 |
| 0.6916666666666668 | 137.347 |
| 0.6923611111111111 | 137.347 |
| 0.6930555555555555 | 146.423 |
| 0.69375 | 150.964 |
| 0.6944444444444445 | 155.509 |
| 0.6951388888888889 | 160.056 |
| 0.6958333333333333 | 169.156 |
| 0.6965277777777777 | 173.709 |
| 0.6972222222222223 | 182.82 |
| 0.6979166666666666 | 191.937 |
| 0.6986111111111111 | 210.182 |
| 0.6993055555555556 | 233 |
| 0.7000000000000001 | 255.813 |
| 0.7006944444444444 | 269.49 |
| 0.7013888888888888 | 278.603 |
| 0.7020833333333334 | 292.259 |
| 0.7027777777777778 | 305.898 |
| 0.7034722222222222 | 314.98 |
| 0.7041666666666666 | 324.052 |
| 0.7048611111111112 | 324.052 |
| 0.7055555555555556 | 328.584 |
| 0.7062499999999999 | 328.584 |
| 0.7069444444444444 | 328.584 |
| 0.7076388888888889 | 333.113 |
| 0.7083333333333334 | 328.584 |
| 0.7090277777777777 | 328.584 |
| 0.7097222222222223 | 328.584 |
| 0.7104166666666667 | 324.052 |
| 0.7111111111111111 | 319.517 |
| 0.7118055555555555 | 314.98 |
| 0.7125 | 314.98 |
| 0.7131944444444445 | 305.898 |
| 0.7138888888888889 | 296.808 |
| 0.7145833333333332 | 292.259 |
| 0.7152777777777778 | 287.709 |
| 0.7159722222222222 | 283.156 |
| 0.7166666666666667 | 278.603 |
| 0.717361111111111 | 274.047 |
| 0.7180555555555556 | 269.49 |
| 0.71875 | 260.373 |
| 0.7194444444444444 | 255.813 |
| 0.720138888888889 | 255.813 |
| 0.7208333333333333 | 255.813 |
| 0.7215277777777778 | 251.251 |
| 0.7222222222222222 | 246.689 |
| 0.7229166666666668 | 246.689 |
| 0.7236111111111111 | 233 |
| 0.7243055555555555 | 219.309 |
| 0.725 | 233 |
| 0.7256944444444445 | 228.436 |
| 0.7263888888888889 | 228.436 |
| 0.7270833333333333 | 214.746 |
| 0.7277777777777777 | 187.378 |
| 0.7284722222222223 | 178.264 |
| 0.7291666666666666 | 173.709 |
| 0.7298611111111111 | 173.709 |
| 0.7305555555555556 | 191.937 |
| 0.7312500000000001 | 182.82 |
| 0.7319444444444444 | 201.058 |
| 0.7326388888888888 | 191.937 |
| 0.7333333333333334 | 191.937 |
| 0.7340277777777778 | 214.746 |
| 0.7347222222222222 | 214.746 |
| 0.7354166666666666 | 214.746 |
| 0.7361111111111112 | 210.182 |
| 0.7368055555555556 | 210.182 |
| 0.7374999999999999 | 210.182 |
| 0.7381944444444444 | 205.62 |
| 0.7388888888888889 | 205.62 |
| 0.7395833333333334 | 201.058 |
| 0.7402777777777777 | 201.058 |
| 0.7409722222222223 | 201.058 |
| 0.7416666666666667 | 201.058 |
| 0.7423611111111111 | 196.497 |
| 0.7430555555555555 | 196.497 |
| 0.74375 | 196.497 |
| 0.7444444444444445 | 191.937 |
| 0.7451388888888889 | 191.937 |
| 0.7458333333333332 | 191.937 |
| 0.7465277777777778 | 191.937 |
| 0.7472222222222222 | 191.937 |
| 0.7479166666666667 | 191.937 |
| 0.748611111111111 | 187.378 |
| 0.7493055555555556 | 187.378 |
| 0.75 | 187.378 |
| 0.7506944444444444 | 182.82 |
| 0.751388888888889 | 178.264 |
| 0.7520833333333333 | 178.264 |
| 0.7527777777777778 | 173.709 |
| 0.7534722222222222 | 173.709 |
| 0.7541666666666668 | 173.709 |
| 0.7548611111111111 | 173.709 |
| 0.7555555555555555 | 173.709 |
| 0.75625 | 173.709 |
| 0.7569444444444445 | 173.709 |
| 0.7576388888888889 | 173.709 |
| 0.7583333333333333 | 173.709 |
| 0.7590277777777777 | 173.709 |
| 0.7597222222222223 | 169.156 |
| 0.7604166666666666 | 169.156 |
| 0.7611111111111111 | 164.605 |
| 0.7618055555555556 | 160.056 |
| 0.7625000000000001 | 155.509 |
| 0.7631944444444444 | 155.509 |
| 0.7638888888888888 | 155.509 |
| 0.7645833333333334 | 150.964 |
| 0.7652777777777778 | 150.964 |
| 0.7659722222222222 | 146.423 |
| 0.7666666666666666 | 146.423 |
| 0.7673611111111112 | 141.884 |
| 0.7680555555555556 | 141.884 |
| 0.7687499999999999 | 137.347 |
| 0.7694444444444444 | 137.347 |
| 0.7701388888888889 | 137.347 |
| 0.7708333333333334 | 132.814 |
| 0.7715277777777777 | 132.814 |
| 0.7722222222222223 | 128.284 |
| 0.7729166666666667 | 128.284 |
| 0.7736111111111111 | 128.284 |
| 0.7743055555555555 | 123.758 |
| 0.775 | 123.758 |
| 0.7756944444444445 | 123.758 |
| 0.7763888888888889 | 119.235 |
| 0.7770833333333332 | 119.235 |
| 0.7777777777777778 | 119.235 |
| 0.7784722222222222 | 119.235 |
| 0.7791666666666667 | 114.716 |
| 0.779861111111111 | 114.716 |
| 0.7805555555555556 | 114.716 |
| 0.78125 | 110.201 |
| 0.7819444444444444 | 110.201 |
| 0.782638888888889 | 110.201 |
| 0.7833333333333333 | 110.201 |
| 0.7840277777777778 | 105.69 |
| 0.7847222222222222 | 105.69 |
| 0.7854166666666668 | 105.69 |
| 0.7861111111111111 | 101.184 |
| 0.7868055555555555 | 101.184 |
| 0.7875 | 101.184 |
| 0.7881944444444445 | 101.184 |
| 0.7888888888888889 | 96.682 |
| 0.7895833333333333 | 96.682 |
| 0.7902777777777777 | 96.682 |
| 0.7909722222222223 | 92.184 |
| 0.7916666666666666 | 92.184 |
| 0.7923611111111111 | 92.184 |
| 0.7930555555555556 | 92.184 |
| 0.7937500000000001 | 87.692 |
| 0.7944444444444444 | 87.692 |
| 0.7951388888888888 | 87.692 |
| 0.7958333333333334 | 83.205 |
| 0.7965277777777778 | 83.205 |
| 0.7972222222222222 | 83.205 |
| 0.7979166666666666 | 78.722 |
| 0.7986111111111112 | 78.722 |
| 0.7993055555555556 | 78.722 |
| 0.7999999999999999 | 74.246 |
| 0.8006944444444444 | 74.246 |
| 0.8013888888888889 | 74.246 |
| 0.8020833333333334 | 74.246 |
| 0.8027777777777777 | 74.246 |
| 0.8034722222222223 | 69.775 |
| 0.8041666666666667 | 69.775 |
| 0.8048611111111111 | 69.775 |
| 0.8055555555555555 | 65.31 |
| 0.80625 | 65.31 |
| 0.8069444444444445 | 65.31 |
| 0.8076388888888889 | 65.31 |
| 0.8083333333333332 | 65.31 |
| 0.8090277777777778 | 60.85 |
| 0.8097222222222222 | 60.85 |
| 0.8104166666666667 | 60.85 |
| 0.811111111111111 | 56.398 |
| 0.8118055555555556 | 56.398 |
| 0.8125 | 56.398 |
| 0.8131944444444444 | 56.398 |
| 0.813888888888889 | 51.951 |
| 0.8145833333333333 | 51.951 |
| 0.8152777777777778 | 51.951 |
| 0.8159722222222222 | 51.951 |
| 0.8166666666666668 | 47.511 |
| 0.8173611111111111 | 47.511 |
| 0.8180555555555555 | 47.511 |
| 0.81875 | 47.511 |
| 0.8194444444444445 | 43.079 |
| 0.8201388888888889 | 43.079 |
| 0.8208333333333333 | 43.079 |
| 0.8215277777777777 | 43.079 |
| 0.8222222222222223 | 38.653 |
| 0.8229166666666666 | 38.653 |
| 0.8236111111111111 | 38.653 |
| 0.8243055555555556 | 38.653 |
| 0.8250000000000001 | 34.234 |
| 0.8256944444444444 | 34.234 |
| 0.8263888888888888 | 34.234 |
| 0.8270833333333334 | 34.234 |
| 0.8277777777777778 | 29.823 |
| 0.8284722222222222 | 29.823 |
| 0.8291666666666666 | 29.823 |
| 0.8298611111111112 | 29.823 |
| 0.8305555555555556 | 25.419 |
| 0.8312499999999999 | 25.419 |
| 0.8319444444444444 | 25.419 |
| 0.8326388888888889 | 25.419 |
| 0.8333333333333334 | 21.024 |
| 0.8340277777777777 | 21.024 |
| 0.8347222222222223 | 21.024 |
| 0.8354166666666667 | 21.024 |
| 0.8361111111111111 | 16.636 |
| 0.8368055555555555 | 16.636 |
| 0.8375 | 16.636 |
| 0.8381944444444445 | 12.257 |
| 0.8388888888888889 | 12.257 |
| 0.8395833333333332 | 12.257 |
| 0.8402777777777778 | 12.257 |
| 0.8409722222222222 | 7.887 |
| 0.8416666666666667 | 7.887 |
| 0.842361111111111 | 7.887 |
| 0.8430555555555556 | 7.887 |
| 0.84375 | 7.887 |
| 0.8444444444444444 | 3.525 |
| 0.845138888888889 | 3.525 |
| 0.8458333333333333 | 3.525 |
| 0.8465277777777778 | 3.525 |
| 0.8472222222222222 | 3.525 |
| 0.8479166666666668 | 3.525 |
| 0.8486111111111111 | 3.525 |
| 0.8493055555555555 | 3.525 |
| 0.85 | 0 |
| 0.8506944444444445 | 0 |
| 0.8513888888888889 | 0 |
| 0.8520833333333333 | 0 |
| 0.8527777777777777 | 0 |
| 0.8534722222222223 | 0 |
| 0.8541666666666666 | 0 |
| 0.8548611111111111 | 0 |
| 0.8555555555555556 | 0 |
| 0.8562500000000001 | 0 |
| 0.8569444444444444 | 0 |
| 0.8576388888888888 | 0 |
| 0.8583333333333334 | 0 |
| 0.8590277777777778 | 0 |
| 0.8597222222222222 | 0 |
| 0.8604166666666666 | 0 |
| 0.8611111111111112 | 0 |
| 0.8618055555555556 | 0 |
| 0.8624999999999999 | 0 |
| 0.8631944444444444 | 0 |
| 0.8638888888888889 | 0 |
| 0.8645833333333334 | 0 |
| 0.8652777777777777 | 0 |
| 0.8659722222222223 | 0 |
| 0.8666666666666667 | 0 |
| 0.8673611111111111 | 0 |
| 0.8680555555555555 | 0 |
| 0.86875 | 0 |
| 0.8694444444444445 | 0 |
| 0.8701388888888889 | 0 |
| 0.8708333333333332 | 0 |
| 0.8715277777777778 | 0 |
| 0.8722222222222222 | 0 |
| 0.8729166666666667 | 0 |
| 0.873611111111111 | 0 |
| 0.8743055555555556 | 0 |
| 0.875 | 0 |
| 0.8756944444444444 | 0 |
| 0.876388888888889 | 0 |
| 0.8770833333333333 | 0 |
| 0.8777777777777778 | 0 |
| 0.8784722222222222 | 0 |
| 0.8791666666666668 | 0 |
| 0.8798611111111111 | 0 |
| 0.8805555555555555 | 0 |
| 0.88125 | 0 |
| 0.8819444444444445 | 0 |
| 0.8826388888888889 | 0 |
| 0.8833333333333333 | 0 |
| 0.8840277777777777 | 0 |
| 0.8847222222222223 | 0 |
| 0.8854166666666666 | 0 |
| 0.8861111111111111 | 0 |
| 0.8868055555555556 | 0 |
| 0.8875000000000001 | 0 |
| 0.8881944444444444 | 0 |
| 0.8888888888888888 | 0 |
| 0.8895833333333334 | 0 |
| 0.8902777777777778 | 0 |
| 0.8909722222222222 | 0 |
| 0.8916666666666666 | 0 |
| 0.8923611111111112 | 0 |
| 0.8930555555555556 | 0 |
| 0.8937499999999999 | 0 |
| 0.8944444444444444 | 0 |
| 0.8951388888888889 | 0 |
| 0.8958333333333334 | 0 |
| 0.8965277777777777 | 0 |
| 0.8972222222222223 | 0 |
| 0.8979166666666667 | 0 |
| 0.8986111111111111 | 0 |
| 0.8993055555555555 | 0 |
| 0.9 | 0 |
| 0.9006944444444445 | 0 |
| 0.9013888888888889 | 0 |
| 0.9020833333333332 | 0 |
| 0.9027777777777778 | 0 |
| 0.9034722222222222 | 0 |
| 0.9041666666666667 | 0 |
| 0.904861111111111 | 0 |
| 0.9055555555555556 | 0 |
| 0.90625 | 0 |
| 0.9069444444444444 | 0 |
| 0.907638888888889 | 0 |
| 0.9083333333333333 | 0 |
| 0.9090277777777778 | 0 |
| 0.9097222222222222 | 0 |
| 0.9104166666666668 | 0 |
| 0.9111111111111111 | 0 |
| 0.9118055555555555 | 0 |
| 0.9125 | 0 |
| 0.9131944444444445 | 0 |
| 0.9138888888888889 | 0 |
| 0.9145833333333333 | 0 |
| 0.9152777777777777 | 0 |
| 0.9159722222222223 | 0 |
| 0.9166666666666666 | 0 |
| 0.9173611111111111 | 0 |
| 0.9180555555555556 | 0 |
| 0.9187500000000001 | 0 |
| 0.9194444444444444 | 0 |
| 0.9201388888888888 | 0 |
| 0.9208333333333334 | 0 |
| 0.9215277777777778 | 0 |
| 0.9222222222222222 | 0 |
| 0.9229166666666666 | 0 |
| 0.9236111111111112 | 0 |
| 0.9243055555555556 | 0 |
| 0.9249999999999999 | 0 |
| 0.9256944444444444 | 0 |
| 0.9263888888888889 | 0 |
| 0.9270833333333334 | 0 |
| 0.9277777777777777 | 0 |
| 0.9284722222222223 | 0 |
| 0.9291666666666667 | 0 |
| 0.9298611111111111 | 0 |
| 0.9305555555555555 | 0 |
| 0.93125 | 0 |
| 0.9319444444444445 | 0 |
| 0.9326388888888889 | 0 |
| 0.9333333333333332 | 0 |
| 0.9340277777777778 | 0 |
| 0.9347222222222222 | 0 |
| 0.9354166666666667 | 0 |
| 0.936111111111111 | 0 |
| 0.9368055555555556 | 0 |
| 0.9375 | 0 |
| 0.9381944444444444 | 0 |
| 0.938888888888889 | 0 |
| 0.9395833333333333 | 0 |
| 0.9402777777777778 | 0 |
| 0.9409722222222222 | 0 |
| 0.9416666666666668 | 0 |
| 0.9423611111111111 | 0 |
| 0.9430555555555555 | 0 |
| 0.94375 | 0 |
| 0.9444444444444445 | 0 |
| 0.9451388888888889 | 0 |
| 0.9458333333333333 | 0 |
| 0.9465277777777777 | 0 |
| 0.9472222222222223 | 0 |
| 0.9479166666666666 | 0 |
| 0.9486111111111111 | 0 |
| 0.9493055555555556 | 0 |
| 0.9500000000000001 | 0 |
| 0.9506944444444444 | 0 |
| 0.9513888888888888 | 0 |
| 0.9520833333333334 | 0 |
| 0.9527777777777778 | 0 |
| 0.9534722222222222 | 0 |
| 0.9541666666666666 | 0 |
| 0.9548611111111112 | 0 |
| 0.9555555555555556 | 0 |
| 0.9562499999999999 | 0 |
| 0.9569444444444444 | 0 |
| 0.9576388888888889 | 0 |
| 0.9583333333333334 | 0 |
| 0.9590277777777777 | 0 |
| 0.9597222222222223 | 0 |
| 0.9604166666666667 | 0 |
| 0.9611111111111111 | 0 |
| 0.9618055555555555 | 0 |
| 0.9625 | 0 |
| 0.9631944444444445 | 0 |
| 0.9638888888888889 | 0 |
| 0.9645833333333332 | 0 |
| 0.9652777777777778 | 0 |
| 0.9659722222222222 | 0 |
| 0.9666666666666667 | 0 |
| 0.967361111111111 | 0 |
| 0.9680555555555556 | 0 |
| 0.96875 | 0 |
| 0.9694444444444444 | 0 |
| 0.970138888888889 | 0 |
| 0.9708333333333333 | 0 |
| 0.9715277777777778 | 0 |
| 0.9722222222222222 | 0 |
| 0.9729166666666668 | 0 |
| 0.9736111111111111 | 0 |
| 0.9743055555555555 | 0 |
| 0.975 | 0 |
| 0.9756944444444445 | 0 |
| 0.9763888888888889 | 0 |
| 0.9770833333333333 | 0 |
| 0.9777777777777777 | 0 |
| 0.9784722222222223 | 0 |
| 0.9791666666666666 | 0 |
| 0.9798611111111111 | 0 |
| 0.9805555555555556 | 0 |
| 0.9812500000000001 | 0 |
| 0.9819444444444444 | 0 |
| 0.9826388888888888 | 0 |
| 0.9833333333333334 | 0 |
| 0.9840277777777778 | 0 |
| 0.9847222222222222 | 0 |
| 0.9854166666666666 | 0 |
| 0.9861111111111112 | 0 |
| 0.9868055555555556 | 0 |
| 0.9874999999999999 | 0 |
| 0.9881944444444444 | 0 |
| 0.9888888888888889 | 0 |
| 0.9895833333333334 | 0 |
| 0.9902777777777777 | 0 |
| 0.9909722222222223 | 0 |
| 0.9916666666666667 | 0 |
| 0.9923611111111111 | 0 |
| 0.9930555555555555 | 0 |
| 0.99375 | 0 |
| 0.9944444444444445 | 0 |
| 0.9951388888888889 | 0 |
| 0.9958333333333332 | 0 |
| 0.9965277777777778 | 0 |
| 0.9972222222222222 | 0 |
| 0.9979166666666667 | 0 |
| 0.998611111111111 | 0 |
| 0.9993055555555556 | 0 |